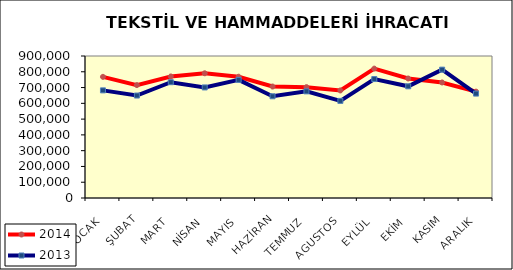
| Category | 2014 | 2013 |
|---|---|---|
| OCAK | 767901.962 | 682155.867 |
| ŞUBAT | 715679.565 | 649400.508 |
| MART | 770352.715 | 733924.665 |
| NİSAN | 790492.524 | 700825.505 |
| MAYIS | 768659.421 | 748576.304 |
| HAZİRAN | 706518.674 | 644671.532 |
| TEMMUZ | 702622.399 | 675793.602 |
| AGUSTOS | 681717.58 | 615565.689 |
| EYLÜL | 819996.545 | 753895.301 |
| EKİM | 757424.728 | 707925.071 |
| KASIM | 732256.357 | 813458.545 |
| ARALIK | 674118.956 | 661700.87 |